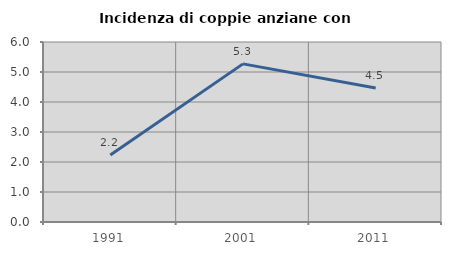
| Category | Incidenza di coppie anziane con figli |
|---|---|
| 1991.0 | 2.233 |
| 2001.0 | 5.271 |
| 2011.0 | 4.468 |